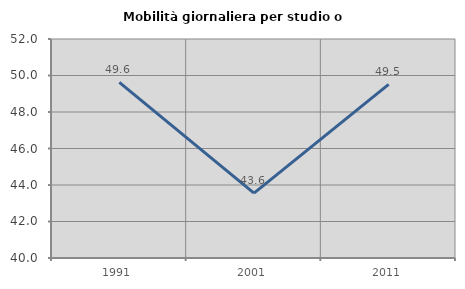
| Category | Mobilità giornaliera per studio o lavoro |
|---|---|
| 1991.0 | 49.626 |
| 2001.0 | 43.55 |
| 2011.0 | 49.514 |